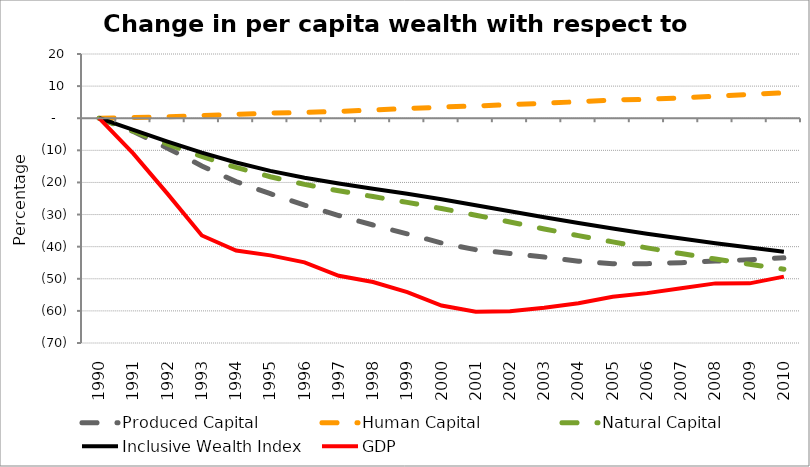
| Category | Produced Capital  | Human Capital | Natural Capital | Inclusive Wealth Index | GDP |
|---|---|---|---|---|---|
| 1990.0 | 0 | 0 | 0 | 0 | 0 |
| 1991.0 | -4.138 | 0.186 | -4.026 | -3.617 | -11.021 |
| 1992.0 | -9.336 | 0.474 | -8.076 | -7.265 | -23.552 |
| 1993.0 | -14.862 | 0.842 | -11.92 | -10.73 | -36.514 |
| 1994.0 | -19.745 | 1.195 | -15.332 | -13.802 | -41.216 |
| 1995.0 | -23.511 | 1.64 | -18.223 | -16.385 | -42.711 |
| 1996.0 | -27.056 | 1.792 | -20.603 | -18.54 | -44.879 |
| 1997.0 | -30.301 | 2.122 | -22.603 | -20.335 | -49.069 |
| 1998.0 | -33.25 | 2.54 | -24.399 | -21.937 | -51.016 |
| 1999.0 | -36.001 | 3.022 | -26.199 | -23.533 | -54.126 |
| 2000.0 | -38.84 | 3.455 | -28.127 | -25.247 | -58.318 |
| 2001.0 | -40.943 | 3.824 | -30.193 | -27.076 | -60.293 |
| 2002.0 | -42.108 | 4.234 | -32.33 | -28.946 | -60.089 |
| 2003.0 | -43.232 | 4.672 | -34.475 | -30.82 | -59.035 |
| 2004.0 | -44.524 | 5.147 | -36.553 | -32.634 | -57.605 |
| 2005.0 | -45.291 | 5.66 | -38.521 | -34.337 | -55.622 |
| 2006.0 | -45.304 | 5.903 | -40.38 | -35.956 | -54.471 |
| 2007.0 | -44.97 | 6.325 | -42.152 | -37.475 | -52.96 |
| 2008.0 | -44.496 | 6.86 | -43.846 | -38.91 | -51.433 |
| 2009.0 | -44.063 | 7.419 | -45.472 | -40.284 | -51.429 |
| 2010.0 | -43.466 | 7.935 | -47.039 | -41.607 | -49.328 |